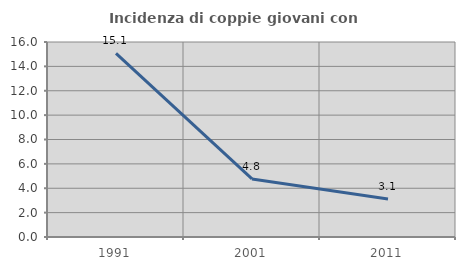
| Category | Incidenza di coppie giovani con figli |
|---|---|
| 1991.0 | 15.068 |
| 2001.0 | 4.762 |
| 2011.0 | 3.125 |